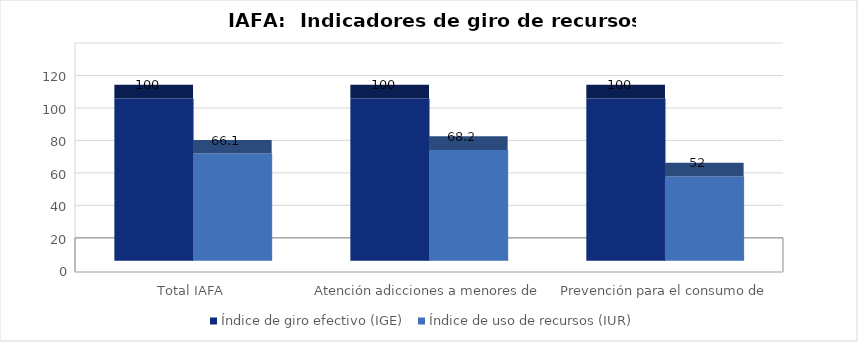
| Category | Índice de giro efectivo (IGE) | Índice de uso de recursos (IUR)  |
|---|---|---|
| Total IAFA | 100 | 66.076 |
| Atención adicciones a menores de edad | 100 | 68.249 |
| Prevención para el consumo de drogas | 100 | 52.005 |